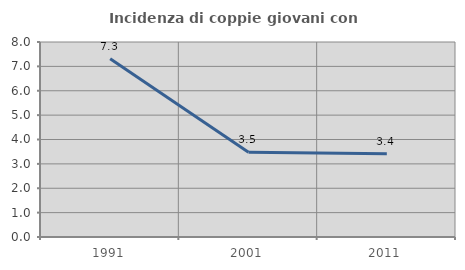
| Category | Incidenza di coppie giovani con figli |
|---|---|
| 1991.0 | 7.311 |
| 2001.0 | 3.481 |
| 2011.0 | 3.419 |